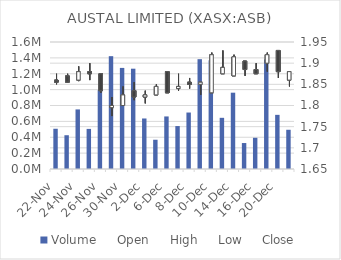
| Category | Volume |
|---|---|
| 2021-11-22 | 507096 |
| 2021-11-23 | 425560 |
| 2021-11-24 | 750650 |
| 2021-11-25 | 505146 |
| 2021-11-26 | 993854 |
| 2021-11-29 | 1421505 |
| 2021-11-30 | 1273578 |
| 2021-12-01 | 1263650 |
| 2021-12-02 | 636479 |
| 2021-12-03 | 368628 |
| 2021-12-06 | 662139 |
| 2021-12-07 | 541028 |
| 2021-12-08 | 711476 |
| 2021-12-09 | 1383638 |
| 2021-12-10 | 1369625 |
| 2021-12-13 | 644808 |
| 2021-12-14 | 961436 |
| 2021-12-15 | 327151 |
| 2021-12-16 | 393275 |
| 2021-12-17 | 1380826 |
| 2021-12-20 | 682150 |
| 2021-12-21 | 494217 |